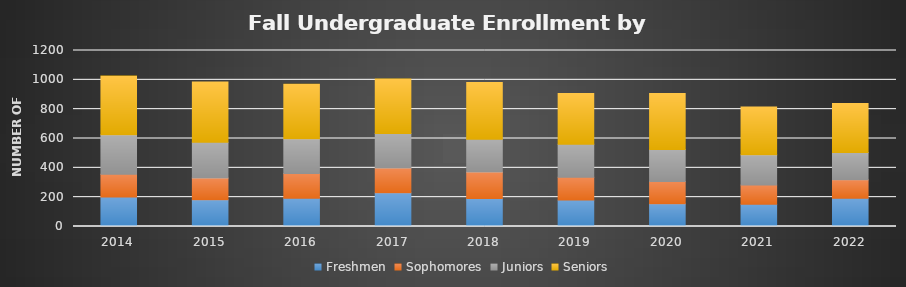
| Category | Freshmen | Sophomores | Juniors | Seniors |
|---|---|---|---|---|
| 2014 | 201 | 156 | 268 | 401 |
| 2015 | 183 | 148 | 243 | 412 |
| 2016 | 192 | 170 | 236 | 372 |
| 2017 | 230 | 169 | 235 | 371 |
| 2018 | 191 | 181 | 223 | 387 |
| 2019 | 180 | 155 | 225 | 346 |
| 2020 | 155 | 151 | 219 | 382 |
| 2021 | 152 | 131 | 206 | 326 |
| 2022 | 193 | 125 | 186 | 334 |